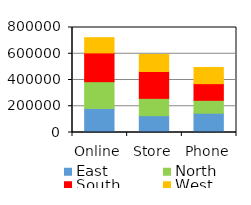
| Category | East | North | South | West |
|---|---|---|---|---|
| Online | 183127 | 204076 | 219182 | 115989 |
| Store | 128043 | 132249 | 204397 | 129426 |
| Phone | 146858 | 98239 | 126966 | 123049 |